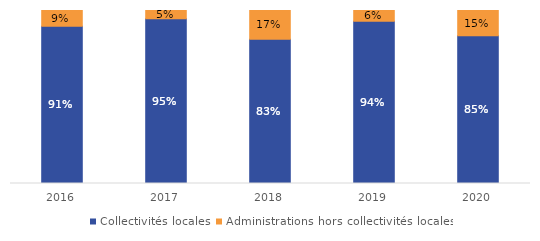
| Category | Collectivités locales | Administrations hors collectivités locales |
|---|---|---|
| 2016.0 | 0.909 | 0.091 |
| 2017.0 | 0.952 | 0.048 |
| 2018.0 | 0.833 | 0.167 |
| 2019.0 | 0.938 | 0.062 |
| 2020.0 | 0.854 | 0.146 |